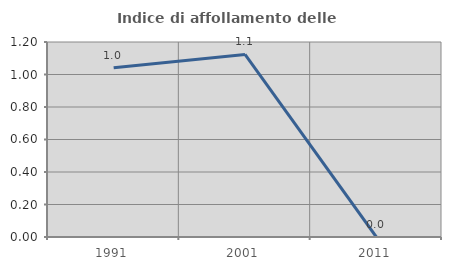
| Category | Indice di affollamento delle abitazioni  |
|---|---|
| 1991.0 | 1.042 |
| 2001.0 | 1.124 |
| 2011.0 | 0 |